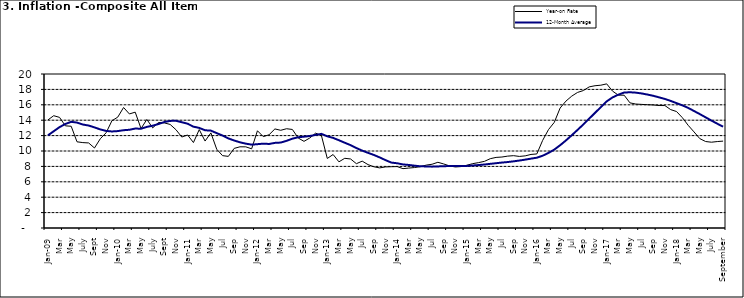
| Category | Year-on Rate | 12-Month Average |
|---|---|---|
| Jan-09 | 14.034 | 12.032 |
| Feb | 14.584 | 12.567 |
| Mar | 14.366 | 13.101 |
| Apr | 13.268 | 13.51 |
| May | 13.212 | 13.787 |
| June | 11.194 | 13.694 |
| July | 11.09 | 13.437 |
| Aug | 11.046 | 13.307 |
| Sept | 10.39 | 13.065 |
| Oct | 11.588 | 12.803 |
| Nov | 12.368 | 12.609 |
| Dec | 13.93 | 12.538 |
| Jan-10 | 14.398 | 12.586 |
| Feb | 15.649 | 12.7 |
| Mar | 14.812 | 12.757 |
| Apr | 15.044 | 12.915 |
| May | 12.915 | 12.893 |
| June | 14.099 | 13.132 |
| July | 13.002 | 13.284 |
| Aug | 13.702 | 13.5 |
| Sept | 13.65 | 13.764 |
| Oct | 13.45 | 13.908 |
| Nov | 12.766 | 13.928 |
| Dec | 11.815 | 13.74 |
| Jan-11 | 12.08 | 13.542 |
| Feb | 11.1 | 13.161 |
| Mar | 12.779 | 13.001 |
| Apr | 11.291 | 12.694 |
| May | 12.352 | 12.648 |
| Jun | 10.23 | 12.321 |
| Jul | 9.397 | 12.009 |
| Aug | 9.301 | 11.635 |
| Sep | 10.339 | 11.363 |
| Oct | 10.544 | 11.13 |
| Nov | 10.54 | 10.952 |
| Dec | 10.283 | 10.826 |
| Jan-12 | 12.626 | 10.886 |
| Feb | 11.866 | 10.955 |
| Mar | 12.111 | 10.914 |
| Apr | 12.866 | 11.054 |
| May | 12.688 | 11.096 |
| Jun | 12.892 | 11.32 |
| Jul | 12.797 | 11.599 |
| Aug | 11.689 | 11.791 |
| Sep | 11.253 | 11.859 |
| Oct | 11.693 | 11.948 |
| Nov | 12.32 | 12.091 |
| Dec | 11.981 | 12.224 |
| Jan-13 | 9.031 | 11.908 |
| Feb | 9.542 | 11.703 |
| Mar | 8.593 | 11.394 |
| Apr | 9.052 | 11.072 |
| May | 8.964 | 10.761 |
| Jun | 8.353 | 10.383 |
| Jul | 8.682 | 10.047 |
| Aug | 8.231 | 9.761 |
| Sep | 7.952 | 9.486 |
| Oct | 7.807 | 9.167 |
| Nov | 7.931 | 8.815 |
| Dec | 7.957 | 8.496 |
| Jan-14 | 7.977 | 8.408 |
| Feb | 7.707 | 8.257 |
| Mar | 7.783 | 8.19 |
| Apr | 7.851 | 8.092 |
| May | 7.965 | 8.012 |
| Jun | 8.167 | 7.998 |
| Jul | 8.281 | 7.968 |
| Aug | 8.534 | 7.996 |
| Sep | 8.317 | 8.027 |
| Oct | 8.06 | 8.047 |
| Nov | 7.927 | 8.046 |
| Dec | 7.978 | 8.047 |
| Jan-15 | 8.157 | 8.063 |
| Feb | 8.359 | 8.117 |
| Mar | 8.494 | 8.176 |
| Apr | 8.655 | 8.243 |
| May | 9.003 | 8.331 |
| Jun | 9.168 | 8.417 |
| Jul | 9.218 | 8.497 |
| Aug | 9.336 | 8.566 |
| Sep | 9.394 | 8.658 |
| Oct | 9.296 | 8.76 |
| Nov | 9.368 | 8.879 |
| Dec | 9.554 | 9.009 |
| Jan-16 | 9.617 | 9.13 |
| Feb | 11.379 | 9.386 |
| Mar | 12.775 | 9.751 |
| Apr | 13.721 | 10.182 |
| May | 15.577 | 10.746 |
| Jun | 16.48 | 11.372 |
| Jul | 17.127 | 12.045 |
| Aug | 17.609 | 12.744 |
| Sep | 17.852 | 13.454 |
| Oct | 18.33 | 14.206 |
| Nov | 18.476 | 14.958 |
| Dec | 18.547 | 15.697 |
| Jan-17 | 18.719 | 16.441 |
| Feb | 17.78 | 16.958 |
| Mar | 17.256 | 17.315 |
| Apr | 17.244 | 17.591 |
| May | 16.251 | 17.628 |
| Jun | 16.098 | 17.578 |
| Jul | 16.053 | 17.475 |
| Aug | 16.012 | 17.331 |
| Sep | 15.979 | 17.17 |
| Oct | 15.905 | 16.968 |
| Nov | 15.901 | 16.76 |
| Dec | 15.372 | 16.502 |
| Jan-18 | 15.127 | 16.215 |
| Feb | 14.33 | 15.93 |
| Mar | 13.337 | 15.599 |
| Apr | 12.482 | 15.196 |
| May | 11.608 | 14.793 |
| June | 11.231 | 14.371 |
| July | 11.142 | 13.95 |
| August | 11.227 | 13.546 |
| September | 11.284 | 13.157 |